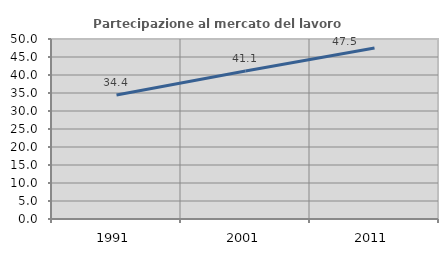
| Category | Partecipazione al mercato del lavoro  femminile |
|---|---|
| 1991.0 | 34.43 |
| 2001.0 | 41.117 |
| 2011.0 | 47.49 |